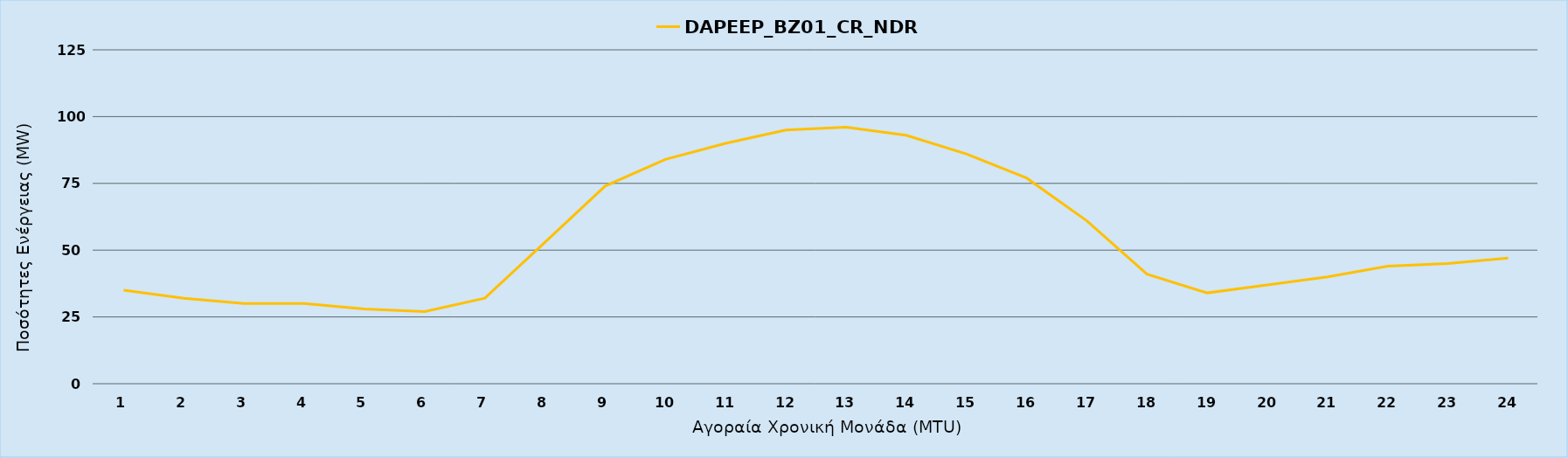
| Category | DAPEEP_BZ01_CR_NDR |
|---|---|
| 0 | 35 |
| 1 | 32 |
| 2 | 30 |
| 3 | 30 |
| 4 | 28 |
| 5 | 27 |
| 6 | 32 |
| 7 | 53 |
| 8 | 74 |
| 9 | 84 |
| 10 | 90 |
| 11 | 95 |
| 12 | 96 |
| 13 | 93 |
| 14 | 86 |
| 15 | 77 |
| 16 | 61 |
| 17 | 41 |
| 18 | 34 |
| 19 | 37 |
| 20 | 40 |
| 21 | 44 |
| 22 | 45 |
| 23 | 47 |